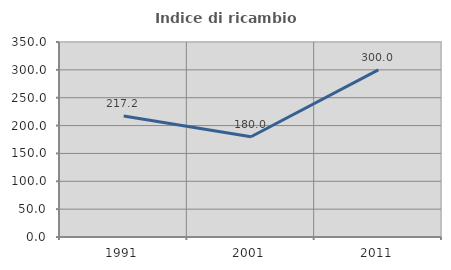
| Category | Indice di ricambio occupazionale  |
|---|---|
| 1991.0 | 217.241 |
| 2001.0 | 180 |
| 2011.0 | 300 |